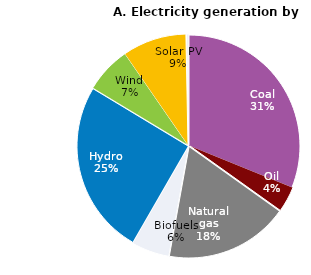
| Category | Series 0 |
|---|---|
| Coal | 25488 |
| Oil | 3048 |
| Natural gas | 14716 |
| Biofuels | 4494 |
| Hydro | 20715 |
| Wind | 5524 |
| Solar PV | 7619 |
| Others | 247 |